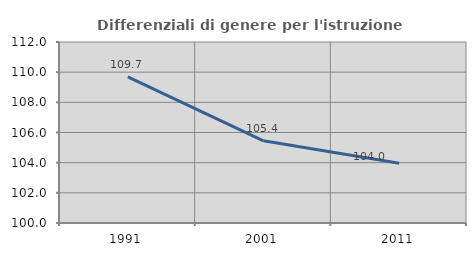
| Category | Differenziali di genere per l'istruzione superiore |
|---|---|
| 1991.0 | 109.686 |
| 2001.0 | 105.449 |
| 2011.0 | 103.967 |